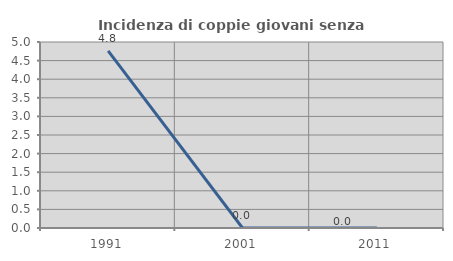
| Category | Incidenza di coppie giovani senza figli |
|---|---|
| 1991.0 | 4.762 |
| 2001.0 | 0 |
| 2011.0 | 0 |